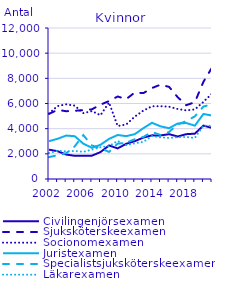
| Category | Civilingenjörsexamen                               | Sjuksköterskeexamen                                | Socionomexamen                                     | Juristexamen                                       | Specialistsjuksköterskeexamen                      | Läkarexamen                                        |
|---|---|---|---|---|---|---|
| 2002.0 | 2333 | 5179 | 5207 | 3006 | 1738 | 2061 |
| 2003.0 | 2208 | 5489 | 5799 | 3195 | 1891 | 2233 |
| 2004.0 | 1943 | 5389 | 5932 | 3452 | 2050 | 2200 |
| 2005.0 | 1845 | 5421 | 5830 | 3401 | 2597 | 2227 |
| 2006.0 | 1845 | 5472 | 5237 | 2808 | 3488 | 2158 |
| 2007.0 | 1855 | 5538 | 5394 | 2479 | 2666 | 2334 |
| 2008.0 | 2138 | 5907 | 5070 | 2718 | 2443 | 2526 |
| 2009.0 | 2666 | 6195 | 6074 | 3188 | 2153 | 2612 |
| 2010.0 | 2431 | 6556 | 4210 | 3494 | 2808 | 3023 |
| 2011.0 | 2797 | 6351 | 4335 | 3407 | 2879 | 2688 |
| 2012.0 | 3006 | 6873 | 4953 | 3564 | 3168 | 2836 |
| 2013.0 | 3292 | 6826 | 5436 | 4036 | 3343 | 2951 |
| 2014.0 | 3468 | 7229 | 5780 | 4468 | 3736 | 3411 |
| 2015.0 | 3461 | 7497 | 5787 | 4184 | 3499 | 3311 |
| 2016.0 | 3562 | 7321 | 5745 | 4036 | 3738 | 3263 |
| 2017.0 | 3378 | 6502 | 5564 | 4410 | 4332 | 3323 |
| 2018.0 | 3563 | 5866 | 5451 | 4448 | 4601 | 3343 |
| 2019.0 | 3602 | 6102 | 5528 | 4237 | 4976 | 3254 |
| 2020.0 | 4242 | 7722 | 6133 | 5166 | 5757 | 4250 |
| 2021.0 | 4061 | 8850 | 6791 | 5041 | 5938 | 4218 |